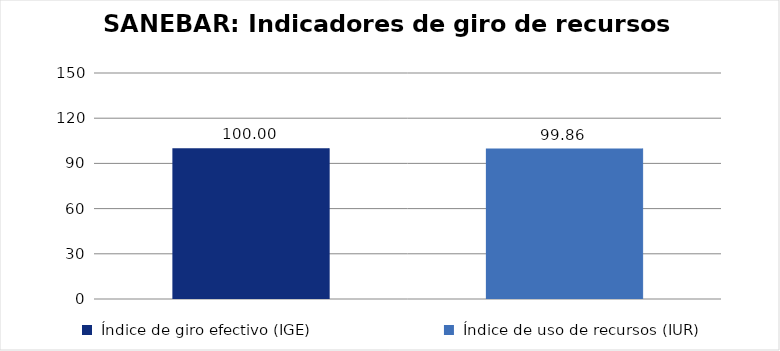
| Category |  Total Programa  |
|---|---|
|  Índice de giro efectivo (IGE)  | 100 |
|  Índice de uso de recursos (IUR)   | 99.861 |